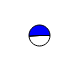
| Category | Series 0 |
|---|---|
| 0 | 15476 |
| 1 | 16200 |